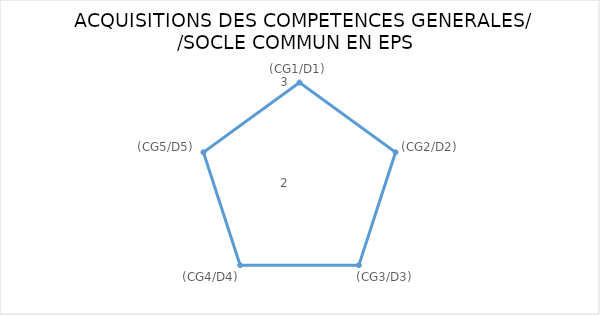
| Category | Series 0 | "" | 1 | 2 | 3 | 4 |
|---|---|---|---|---|---|---|
| (CG1/D1) | 3 |  |  |  |  |  |
| (CG2/D2) | 3 |  |  |  |  |  |
| (CG3/D3) | 3 |  |  |  |  |  |
| (CG4/D4) | 3 |  |  |  |  |  |
| (CG5/D5) | 3 |  |  |  |  |  |